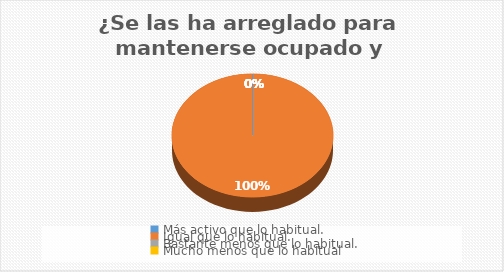
| Category | ¿Se las ha arreglado para mantenerse ocupado y activo? |
|---|---|
| Más activo que lo habitual. | 0 |
| Igual que lo habitual. | 110 |
| Bastante menos que lo habitual. | 0 |
| Mucho menos que lo habitual | 0 |